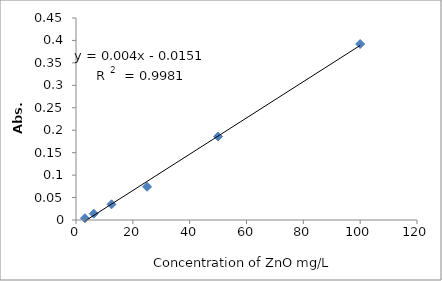
| Category | Series 0 |
|---|---|
| 100.0 | 0.392 |
| 50.0 | 0.186 |
| 25.0 | 0.074 |
| 12.5 | 0.035 |
| 6.25 | 0.014 |
| 3.125 | 0.004 |